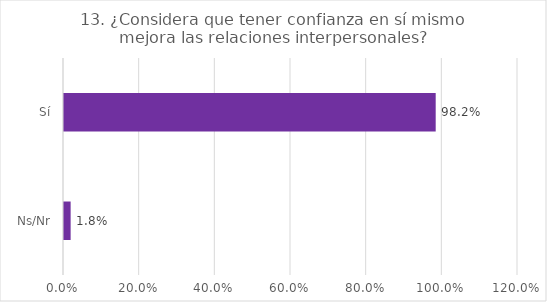
| Category | Series 0 |
|---|---|
| Ns/Nr | 0.018 |
| Sí | 0.982 |